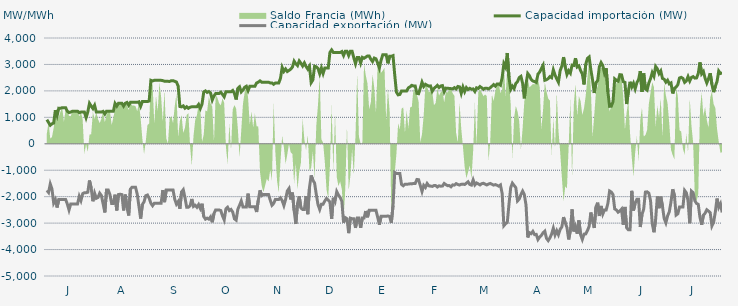
| Category | Capacidad importación (MW) | Capacidad exportación (MW) |
|---|---|---|
| 0 | 912.5 | -1762.5 |
| 1900-01-01 | 806.25 | -1841.667 |
| 1900-01-02 | 700 | -1520.833 |
| 1900-01-03 | 756.25 | -1710.417 |
| 1900-01-04 | 783.333 | -2239.583 |
| 1900-01-05 | 1270.833 | -2112.5 |
| 1900-01-06 | 1066.667 | -2410.417 |
| 1900-01-07 | 1345.833 | -2104.167 |
| 1900-01-08 | 1341.667 | -2104.167 |
| 1900-01-09 | 1366.667 | -2104.167 |
| 1900-01-10 | 1366.667 | -2104.167 |
| 1900-01-11 | 1366.667 | -2104.167 |
| 1900-01-12 | 1231.25 | -2275 |
| 1900-01-13 | 1181.25 | -2504.167 |
| 1900-01-14 | 1200 | -2275 |
| 1900-01-15 | 1233.333 | -2275 |
| 1900-01-16 | 1233.333 | -2275 |
| 1900-01-17 | 1233.333 | -2275 |
| 1900-01-18 | 1233.333 | -2275 |
| 1900-01-19 | 1175 | -1987.5 |
| 1900-01-20 | 1200 | -2147.917 |
| 1900-01-21 | 1200 | -1887.5 |
| 1900-01-22 | 1200 | -1850 |
| 1900-01-23 | 987.5 | -1850 |
| 1900-01-24 | 1200 | -1831.25 |
| 1900-01-25 | 1529.167 | -1387.5 |
| 1900-01-26 | 1427.083 | -1679.167 |
| 1900-01-27 | 1331.25 | -2172.917 |
| 1900-01-28 | 1456.25 | -1868.75 |
| 1900-01-29 | 1200 | -2060.417 |
| 1900-01-30 | 1200 | -2029.167 |
| 1900-01-31 | 1200 | -1868.75 |
| 1900-02-01 | 1200 | -1958.333 |
| 1900-02-02 | 1225 | -2275 |
| 1900-02-03 | 1125 | -2595.833 |
| 1900-02-04 | 1233.333 | -1750 |
| 1900-02-05 | 1233.333 | -1750 |
| 1900-02-06 | 1233.333 | -1925 |
| 1900-02-07 | 1233.333 | -2262.5 |
| 1900-02-08 | 1233.333 | -2262.5 |
| 1900-02-09 | 1525 | -1925 |
| 1900-02-10 | 1425 | -2520.833 |
| 1900-02-11 | 1533.333 | -1920.833 |
| 1900-02-12 | 1533.333 | -1908.333 |
| 1900-02-13 | 1533.333 | -1920.833 |
| 1900-02-14 | 1425 | -2520.833 |
| 1900-02-15 | 1533.333 | -1920.833 |
| 1900-02-16 | 1562.5 | -2412.5 |
| 1900-02-17 | 1454.167 | -2710.417 |
| 1900-02-18 | 1566.667 | -1712.5 |
| 1900-02-19 | 1566.667 | -1641.667 |
| 1900-02-20 | 1566.667 | -1641.667 |
| 1900-02-21 | 1566.667 | -1641.667 |
| 1900-02-22 | 1566.667 | -1904.167 |
| 1900-02-23 | 1587.5 | -2362.5 |
| 1900-02-24 | 1418.75 | -2827.083 |
| 1900-02-25 | 1595.833 | -2297.917 |
| 1900-02-26 | 1595.833 | -2193.75 |
| 1900-02-27 | 1595.833 | -1964.583 |
| 1900-02-28 | 1595.833 | -1937.5 |
| 1900-02-28 | 1618.75 | -2058.333 |
| 1900-03-01 | 2400 | -2250 |
| 1900-03-02 | 2375 | -2341.667 |
| 1900-03-03 | 2400 | -2250 |
| 1900-03-04 | 2400 | -2250 |
| 1900-03-05 | 2400 | -2250 |
| 1900-03-06 | 2400 | -2250 |
| 1900-03-07 | 2400 | -2250 |
| 1900-03-08 | 2387.5 | -1750 |
| 1900-03-09 | 2364.583 | -2208.333 |
| 1900-03-10 | 2364.583 | -1745.833 |
| 1900-03-11 | 2360.417 | -1745.833 |
| 1900-03-12 | 2358.333 | -1745.833 |
| 1900-03-13 | 2387.5 | -1745.833 |
| 1900-03-14 | 2387.5 | -1745.833 |
| 1900-03-15 | 2362.5 | -2100 |
| 1900-03-16 | 2335.417 | -2283.333 |
| 1900-03-17 | 2181.25 | -2187.5 |
| 1900-03-18 | 1408.333 | -2456.25 |
| 1900-03-19 | 1395.833 | -1820.833 |
| 1900-03-20 | 1433.333 | -1737.5 |
| 1900-03-21 | 1345.833 | -2037.5 |
| 1900-03-22 | 1400 | -2400 |
| 1900-03-23 | 1341.667 | -2400 |
| 1900-03-24 | 1383.333 | -2345.833 |
| 1900-03-25 | 1400 | -2087.5 |
| 1900-03-26 | 1400 | -2370.833 |
| 1900-03-27 | 1400 | -2327.083 |
| 1900-03-28 | 1400 | -2400 |
| 1900-03-29 | 1487.5 | -2300 |
| 1900-03-30 | 1337.5 | -2445.833 |
| 1900-03-31 | 1500 | -2266.667 |
| 1900-04-01 | 1958.333 | -2750 |
| 1900-04-02 | 2000 | -2850 |
| 1900-04-03 | 1941.667 | -2812.5 |
| 1900-04-04 | 1975 | -2850 |
| 1900-04-05 | 1920.833 | -2762.5 |
| 1900-04-06 | 1654.167 | -2968.75 |
| 1900-04-07 | 1808.333 | -2639.583 |
| 1900-04-08 | 1900 | -2500 |
| 1900-04-09 | 1900 | -2500 |
| 1900-04-10 | 1900 | -2500 |
| 1900-04-11 | 1950 | -2525 |
| 1900-04-12 | 1866.667 | -2727.083 |
| 1900-04-13 | 1775 | -2877.083 |
| 1900-04-14 | 1966.667 | -2462.5 |
| 1900-04-15 | 1966.667 | -2400 |
| 1900-04-16 | 1966.667 | -2525 |
| 1900-04-17 | 1966.667 | -2483.333 |
| 1900-04-18 | 2016.667 | -2583.333 |
| 1900-04-19 | 1900 | -2837.5 |
| 1900-04-20 | 1675 | -2887.5 |
| 1900-04-21 | 2091.667 | -2477.083 |
| 1900-04-22 | 2154.167 | -2325 |
| 1900-04-23 | 1962.5 | -2162.5 |
| 1900-04-24 | 2029.167 | -2387.5 |
| 1900-04-25 | 2137.5 | -2387.5 |
| 1900-04-26 | 2175 | -2387.5 |
| 1900-04-27 | 2010 | -1886 |
| 1900-04-28 | 2170.833 | -2383.333 |
| 1900-04-29 | 2170.833 | -2383.333 |
| 1900-04-30 | 2170.833 | -2383.333 |
| 1900-05-01 | 2170.833 | -2383.333 |
| 1900-05-02 | 2300 | -2579.167 |
| 1900-05-03 | 2331.25 | -2131.25 |
| 1900-05-04 | 2379.167 | -1758.333 |
| 1900-05-05 | 2329.167 | -1960.417 |
| 1900-05-06 | 2329.167 | -1916.667 |
| 1900-05-07 | 2329.167 | -1916.667 |
| 1900-05-08 | 2329.167 | -1916.667 |
| 1900-05-09 | 2329.167 | -1918.75 |
| 1900-05-10 | 2300 | -2131.25 |
| 1900-05-11 | 2300 | -2325 |
| 1900-05-12 | 2250 | -2256.25 |
| 1900-05-13 | 2300 | -2104.167 |
| 1900-05-14 | 2300 | -2104.167 |
| 1900-05-15 | 2300 | -2104.167 |
| 1900-05-16 | 2475 | -2043.75 |
| 1900-05-17 | 2887.5 | -2150 |
| 1900-05-18 | 2737.5 | -2335.417 |
| 1900-05-19 | 2829.167 | -2106.25 |
| 1900-05-20 | 2732.25 | -1787 |
| 1900-05-21 | 2775 | -1691.667 |
| 1900-05-22 | 2820.833 | -2106.25 |
| 1900-05-23 | 2900 | -1845.833 |
| 1900-05-24 | 3125 | -2520.833 |
| 1900-05-25 | 3025 | -3033.333 |
| 1900-05-26 | 2956.25 | -2250 |
| 1900-05-27 | 3133.333 | -1987.5 |
| 1900-05-28 | 3045.833 | -2425 |
| 1900-05-29 | 2941.667 | -2485.417 |
| 1900-05-30 | 3058.333 | -2483.333 |
| 1900-05-31 | 2925 | -1975 |
| 1900-06-01 | 2825 | -2662.5 |
| 1900-06-02 | 2933.333 | -1658.333 |
| 1900-06-03 | 2312.5 | -1195.833 |
| 1900-06-04 | 2412.5 | -1375 |
| 1900-06-05 | 2933.333 | -1483.333 |
| 1900-06-06 | 2910.417 | -1912.5 |
| 1900-06-07 | 2850 | -2300 |
| 1900-06-08 | 2650 | -2483.333 |
| 1900-06-09 | 2866.667 | -2283.333 |
| 1900-06-10 | 2658.333 | -2283.333 |
| 1900-06-11 | 2866.667 | -2162.5 |
| 1900-06-12 | 2866.667 | -2066.667 |
| 1900-06-13 | 2866.667 | -2129.167 |
| 1900-06-14 | 3456.25 | -2204.167 |
| 1900-06-15 | 3550 | -2837.5 |
| 1900-06-16 | 3454.167 | -2041.667 |
| 1900-06-17 | 3454.167 | -2179.167 |
| 1900-06-18 | 3454.167 | -1808.333 |
| 1900-06-19 | 3454.167 | -1938.75 |
| 1900-06-20 | 3454.167 | -2029.167 |
| 1900-06-21 | 3487.5 | -2175 |
| 1900-06-22 | 3337.5 | -2983.333 |
| 1900-06-23 | 3500 | -2791.667 |
| 1900-06-24 | 3500 | -2833.333 |
| 1900-06-25 | 3337.5 | -3379.167 |
| 1900-06-26 | 3500 | -2812.5 |
| 1900-06-27 | 3500 | -2833.333 |
| 1900-06-28 | 3250 | -2837.5 |
| 1900-06-29 | 3028.25 | -3181.25 |
| 1900-06-30 | 3266.667 | -2808.333 |
| 1900-07-01 | 3266.667 | -2808.333 |
| 1900-07-02 | 3050 | -3181.25 |
| 1900-07-03 | 3266.667 | -2808.333 |
| 1900-07-04 | 3233.333 | -2808.333 |
| 1900-07-05 | 3275 | -2543.75 |
| 1900-07-06 | 3320.833 | -2779.167 |
| 1900-07-07 | 3320.833 | -2516.667 |
| 1900-07-08 | 3195.833 | -2516.667 |
| 1900-07-09 | 3108.333 | -2516.667 |
| 1900-07-10 | 3241.667 | -2516.667 |
| 1900-07-11 | 3212.5 | -2516.667 |
| 1900-07-12 | 3054.167 | -2775 |
| 1900-07-13 | 2862.5 | -3058.333 |
| 1900-07-14 | 3162.5 | -2741.667 |
| 1900-07-15 | 3366.667 | -2741.667 |
| 1900-07-16 | 3366.667 | -2741.667 |
| 1900-07-17 | 3366.667 | -2741.667 |
| 1900-07-18 | 3041.667 | -2729.167 |
| 1900-07-19 | 3306.25 | -2750 |
| 1900-07-20 | 3306.25 | -2991.667 |
| 1900-07-21 | 3333.333 | -2337.5 |
| 1900-07-22 | 2602.083 | -1083.333 |
| 1900-07-23 | 1950 | -1125 |
| 1900-07-24 | 1850 | -1125 |
| 1900-07-25 | 1866.667 | -1125 |
| 1900-07-26 | 2000 | -1537.5 |
| 1900-07-27 | 2000 | -1587.5 |
| 1900-07-28 | 2000 | -1529.167 |
| 1900-07-29 | 2000 | -1529.167 |
| 1900-07-30 | 2114.583 | -1525 |
| 1900-07-31 | 2154.167 | -1512.5 |
| 1900-08-01 | 2210.417 | -1516.667 |
| 1900-08-02 | 2183.333 | -1500 |
| 1900-08-03 | 2185.417 | -1500 |
| 1900-08-04 | 1906.25 | -1350 |
| 1900-08-05 | 1893.75 | -1358.333 |
| 1900-08-06 | 2104.167 | -1579.167 |
| 1900-08-07 | 2328.375 | -1804.167 |
| 1900-08-08 | 2166.667 | -1572.917 |
| 1900-08-09 | 2250 | -1650 |
| 1900-08-10 | 2212.5 | -1502.083 |
| 1900-08-11 | 2179.167 | -1589.583 |
| 1900-08-12 | 2187.5 | -1600 |
| 1900-08-13 | 1987.5 | -1612.5 |
| 1900-08-14 | 2091.667 | -1581.25 |
| 1900-08-15 | 2147.917 | -1581.25 |
| 1900-08-16 | 2208.333 | -1635.417 |
| 1900-08-17 | 2127.083 | -1589.583 |
| 1900-08-18 | 2185.417 | -1604.167 |
| 1900-08-19 | 2200 | -1597.917 |
| 1900-08-20 | 1966.667 | -1500 |
| 1900-08-21 | 2104.167 | -1545.833 |
| 1900-08-22 | 2102.083 | -1583.333 |
| 1900-08-23 | 2089.583 | -1581.25 |
| 1900-08-24 | 2085.417 | -1627.083 |
| 1900-08-25 | 2075 | -1554.167 |
| 1900-08-26 | 2122.917 | -1562.5 |
| 1900-08-27 | 2072.917 | -1508.333 |
| 1900-08-28 | 2166.667 | -1539.583 |
| 1900-08-29 | 2152.083 | -1560.417 |
| 1900-08-30 | 1908.333 | -1531.25 |
| 1900-08-31 | 2145.833 | -1525 |
| 1900-09-01 | 1972.917 | -1539.583 |
| 1900-09-02 | 2125 | -1491.667 |
| 1900-09-03 | 2050 | -1437.5 |
| 1900-09-04 | 2095.833 | -1539.583 |
| 1900-09-05 | 2062.5 | -1562.5 |
| 1900-09-06 | 2075 | -1368.75 |
| 1900-09-07 | 1979.167 | -1556.25 |
| 1900-09-08 | 2116.667 | -1481.25 |
| 1900-09-09 | 2093.75 | -1516.667 |
| 1900-09-10 | 2164.583 | -1556.25 |
| 1900-09-11 | 2116.667 | -1508.333 |
| 1900-09-12 | 2060.417 | -1493.75 |
| 1900-09-13 | 2102.083 | -1525 |
| 1900-09-14 | 2100 | -1556.25 |
| 1900-09-15 | 2075 | -1520.833 |
| 1900-09-16 | 2118.75 | -1500 |
| 1900-09-17 | 2177.083 | -1529.167 |
| 1900-09-18 | 2239.583 | -1562.5 |
| 1900-09-19 | 2177.083 | -1543.75 |
| 1900-09-20 | 2262.5 | -1568.75 |
| 1900-09-21 | 2260.417 | -1602.083 |
| 1900-09-22 | 2214.583 | -1556.25 |
| 1900-09-23 | 2506.25 | -1879.583 |
| 1900-09-24 | 3029.083 | -3096.667 |
| 1900-09-25 | 2897.083 | -3021.292 |
| 1900-09-26 | 3432.292 | -2977.083 |
| 1900-09-27 | 2507.25 | -2284.333 |
| 1900-09-28 | 2060.87 | -1658.696 |
| 1900-09-29 | 2179.167 | -1489.583 |
| 1900-09-30 | 2087.5 | -1575 |
| 1900-10-01 | 2277.417 | -1660.417 |
| 1900-10-02 | 2351.25 | -2160.417 |
| 1900-10-03 | 2503.458 | -2091.667 |
| 1900-10-04 | 2550 | -1920.833 |
| 1900-10-05 | 2281.458 | -1791.667 |
| 1900-10-06 | 1718.75 | -1920.833 |
| 1900-10-07 | 2254.5 | -2322.583 |
| 1900-10-08 | 2658.208 | -3541.417 |
| 1900-10-09 | 2574.708 | -3362.292 |
| 1900-10-10 | 2431.25 | -3398.958 |
| 1900-10-11 | 2374.5 | -3312.25 |
| 1900-10-12 | 2351.333 | -3435.417 |
| 1900-10-13 | 2317.583 | -3426.125 |
| 1900-10-14 | 2635.542 | -3620.708 |
| 1900-10-15 | 2711.542 | -3524.292 |
| 1900-10-16 | 2845.917 | -3464.708 |
| 1900-10-17 | 2969.417 | -3364.5 |
| 1900-10-18 | 2400.667 | -3304.667 |
| 1900-10-19 | 2423.292 | -3576.333 |
| 1900-10-20 | 2466.583 | -3661.208 |
| 1900-10-21 | 2539.583 | -3559.167 |
| 1900-10-22 | 2499 | -3412.958 |
| 1900-10-23 | 2794.042 | -3192.833 |
| 1900-10-24 | 2600.917 | -3446.833 |
| 1900-10-25 | 2454.333 | -3287.042 |
| 1900-10-26 | 2327 | -3437.333 |
| 1900-10-27 | 2764.875 | -3237.25 |
| 1900-10-28 | 2938.333 | -3142.542 |
| 1900-10-29 | 3277.667 | -2773.208 |
| 1900-10-30 | 2901.792 | -2987.042 |
| 1900-10-31 | 2620.125 | -3170.125 |
| 1900-11-01 | 2763 | -3616.833 |
| 1900-11-02 | 2671.542 | -3275.667 |
| 1900-11-03 | 2975.208 | -2481.333 |
| 1900-11-04 | 2963.292 | -3314.083 |
| 1900-11-05 | 3237.125 | -3127.25 |
| 1900-11-06 | 2903.125 | -3401.25 |
| 1900-11-07 | 2943.875 | -2899.917 |
| 1900-11-08 | 2767.417 | -3439.375 |
| 1900-11-09 | 2641.75 | -3616.75 |
| 1900-11-10 | 2244.417 | -3416.167 |
| 1900-11-11 | 3003.875 | -3408.875 |
| 1900-11-12 | 3226.875 | -3283.375 |
| 1900-11-13 | 3282.292 | -3121.542 |
| 1900-11-14 | 2800 | -2600 |
| 1900-11-15 | 2416.667 | -2918.75 |
| 1900-11-16 | 1920.333 | -3184.333 |
| 1900-11-17 | 2307.917 | -2385.917 |
| 1900-11-18 | 2390.792 | -2227.542 |
| 1900-11-19 | 2911.125 | -2730 |
| 1900-11-20 | 3070.25 | -2350.458 |
| 1900-11-21 | 2956.667 | -2656.375 |
| 1900-11-22 | 2670.833 | -2500 |
| 1900-11-23 | 2854.167 | -2500 |
| 1900-11-24 | 1964.208 | -2255.75 |
| 1900-11-25 | 1414.583 | -1785.417 |
| 1900-11-26 | 1420.833 | -1825 |
| 1900-11-27 | 1591.667 | -1922.917 |
| 1900-11-28 | 2454.167 | -2465 |
| 1900-11-29 | 2398.083 | -2503.583 |
| 1900-11-30 | 2366.667 | -2588.042 |
| 1900-12-01 | 2613.333 | -2542.833 |
| 1900-12-02 | 2604.917 | -2471 |
| 1900-12-03 | 2348.667 | -3059.875 |
| 1900-12-04 | 2320.833 | -2387.5 |
| 1900-12-05 | 1502.083 | -3177.542 |
| 1900-12-06 | 1981.25 | -3254.458 |
| 1900-12-07 | 2343.208 | -3252.458 |
| 1900-12-08 | 2147.917 | -1780 |
| 1900-12-09 | 2287.5 | -2525 |
| 1900-12-10 | 2076.167 | -2245.833 |
| 1900-12-11 | 2310.167 | -2100 |
| 1900-12-12 | 2432.875 | -2100 |
| 1900-12-13 | 2745.667 | -3148.25 |
| 1900-12-14 | 1962.5 | -2676.167 |
| 1900-12-15 | 2660.917 | -2469.583 |
| 1900-12-16 | 2079.167 | -1827.083 |
| 1900-12-17 | 2027.083 | -1816.667 |
| 1900-12-18 | 2300 | -1864.583 |
| 1900-12-19 | 2462.5 | -2143.75 |
| 1900-12-20 | 2691.458 | -3018.958 |
| 1900-12-21 | 2552.792 | -3345.333 |
| 1900-12-22 | 2923.125 | -2854.917 |
| 1900-12-23 | 2833.042 | -1993.167 |
| 1900-12-24 | 2653.792 | -2436 |
| 1900-12-25 | 2753.958 | -1999.792 |
| 1900-12-26 | 2473.333 | -2362.833 |
| 1900-12-27 | 2441.667 | -2824.792 |
| 1900-12-28 | 2328.458 | -2988.458 |
| 1900-12-29 | 2403.5 | -2728.542 |
| 1900-12-30 | 2265.917 | -2574.25 |
| 1900-12-31 | 2301.833 | -2201.042 |
| 1901-01-01 | 1903.333 | -1720.833 |
| 1901-01-02 | 2094.667 | -1947.917 |
| 1901-01-03 | 2147.917 | -2694.292 |
| 1901-01-04 | 2232.083 | -2646 |
| 1901-01-05 | 2487.5 | -2387.5 |
| 1901-01-06 | 2512.5 | -2387.5 |
| 1901-01-07 | 2472.917 | -2387.5 |
| 1901-01-08 | 2322 | -1764.625 |
| 1901-01-09 | 2377.5 | -1853.5 |
| 1901-01-10 | 2540.458 | -2160.917 |
| 1901-01-11 | 2372.875 | -3004.125 |
| 1901-01-12 | 2508.625 | -1791.125 |
| 1901-01-13 | 2539.208 | -1849.75 |
| 1901-01-14 | 2483.208 | -2155.417 |
| 1901-01-15 | 2490.375 | -2256.75 |
| 1901-01-16 | 2658.333 | -2291.667 |
| 1901-01-17 | 3076.5 | -2786.667 |
| 1901-01-18 | 2645.958 | -3061.667 |
| 1901-01-19 | 2731.458 | -2699.25 |
| 1901-01-20 | 2480.417 | -2627.458 |
| 1901-01-21 | 2300.833 | -2495 |
| 1901-01-22 | 2461.958 | -2546.167 |
| 1901-01-23 | 2667.458 | -2604.875 |
| 1901-01-24 | 2250.333 | -3105.542 |
| 1901-01-25 | 1952.083 | -2970.875 |
| 1901-01-26 | 2172 | -2579.417 |
| 1901-01-27 | 2356.083 | -2071.833 |
| 1901-01-28 | 2750.708 | -2400.667 |
| 1901-01-29 | 2658.875 | -2268.083 |
| 1901-01-30 | 2681 | -2596.625 |